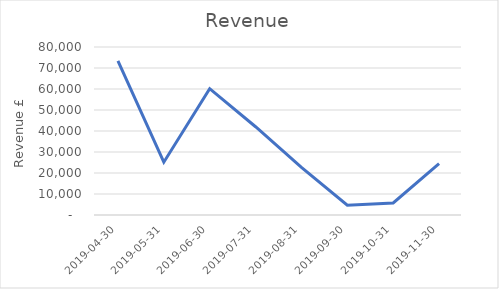
| Category | Total |
|---|---|
| 2019-04-30 | 73420.58 |
| 2019-05-31 | 25150 |
| 2019-06-30 | 60156.67 |
| 2019-07-31 | 42025.84 |
| 2019-08-31 | 22644.17 |
| 2019-09-30 | 4650 |
| 2019-10-31 | 5729.17 |
| 2019-11-30 | 24450 |